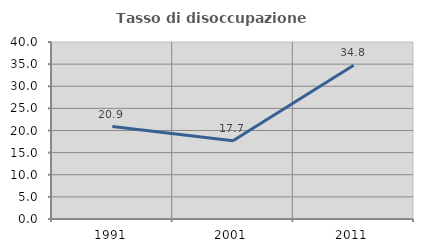
| Category | Tasso di disoccupazione giovanile  |
|---|---|
| 1991.0 | 20.896 |
| 2001.0 | 17.663 |
| 2011.0 | 34.767 |